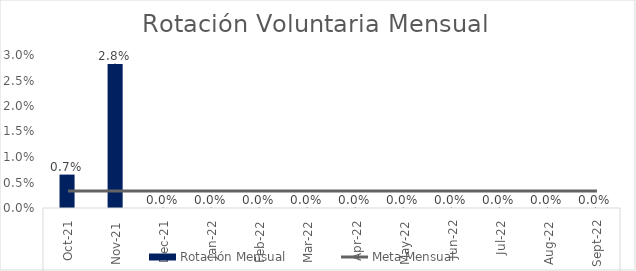
| Category | Series 4 | Series 5 | Rotación Mensual | Series 6 |
|---|---|---|---|---|
| 0 |  |  | 0.007 |  |
| 1 |  |  | 0.028 |  |
| 2 |  |  | 0 |  |
| 3 |  |  | 0 |  |
| 4 |  |  | 0 |  |
| 5 |  |  | 0 |  |
| 6 |  |  | 0 |  |
| 7 |  |  | 0 |  |
| 8 |  |  | 0 |  |
| 9 |  |  | 0 |  |
| 10 |  |  | 0 |  |
| 11 |  |  | 0 |  |